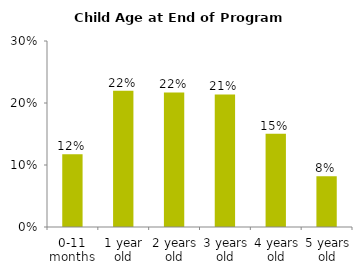
| Category | Series 0 |
|---|---|
| 0-11 months | 0.117 |
| 1 year old | 0.22 |
| 2 years old | 0.217 |
| 3 years old | 0.214 |
| 4 years old | 0.15 |
| 5 years old | 0.082 |